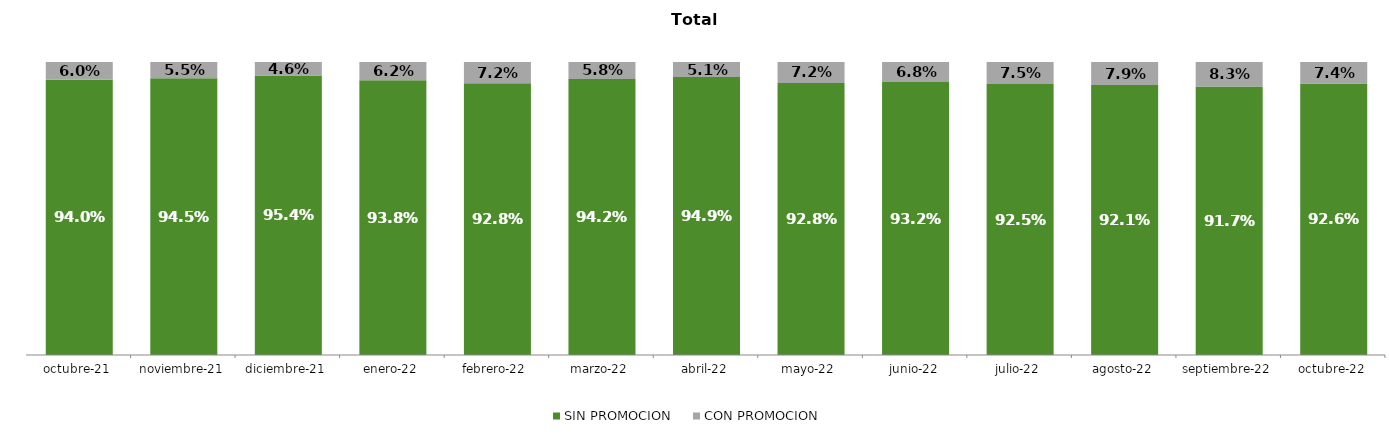
| Category | SIN PROMOCION   | CON PROMOCION   |
|---|---|---|
| 2021-10-01 | 0.94 | 0.06 |
| 2021-11-01 | 0.945 | 0.055 |
| 2021-12-01 | 0.954 | 0.046 |
| 2022-01-01 | 0.938 | 0.062 |
| 2022-02-01 | 0.928 | 0.072 |
| 2022-03-01 | 0.942 | 0.058 |
| 2022-04-01 | 0.949 | 0.051 |
| 2022-05-01 | 0.928 | 0.072 |
| 2022-06-01 | 0.932 | 0.068 |
| 2022-07-01 | 0.925 | 0.075 |
| 2022-08-01 | 0.921 | 0.079 |
| 2022-09-01 | 0.917 | 0.083 |
| 2022-10-01 | 0.926 | 0.074 |